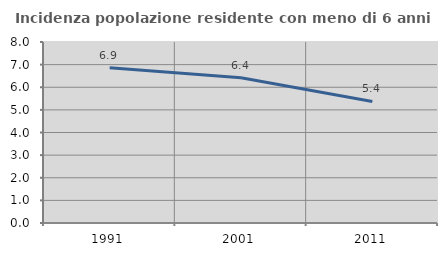
| Category | Incidenza popolazione residente con meno di 6 anni |
|---|---|
| 1991.0 | 6.865 |
| 2001.0 | 6.421 |
| 2011.0 | 5.373 |